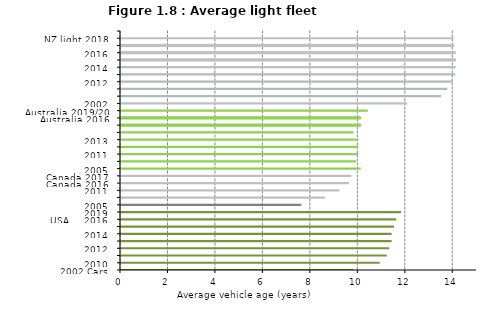
| Category | Average age |
|---|---|
| 2002 Cars | 9.8 |
| 2010 | 10.9 |
|  | 11.2 |
| 2012 | 11.3 |
|  | 11.4 |
| 2014 | 11.4 |
|  | 11.5 |
| USA     2016 | 11.6 |
| 2019 | 11.8 |
| 2005 | 7.6 |
|  | 8.6 |
| 2011 | 9.2 |
| Canada 2016 | 9.6 |
| Canada 2017 | 9.71 |
| 2005 | 10.1 |
|  | 9.9 |
| 2011 | 10 |
|  | 10 |
| 2013 | 10 |
|  | 9.8 |
|  | 10.1 |
| Australia 2016 | 10.1 |
| Australia 2019/20 | 10.4 |
| 2002 | 12.06 |
|  | 13.49 |
|  | 13.75 |
| 2012 | 13.966 |
|  | 14.082 |
| 2014 | 14.1 |
|  | 14.089 |
| 2016 | 14.084 |
|  | 14.029 |
| NZ light 2018 | 14.015 |